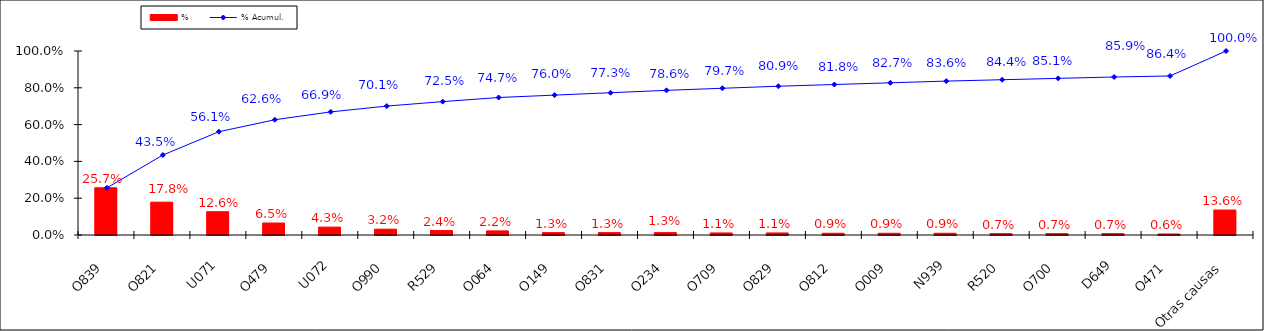
| Category | % |
|---|---|
| O839 | 0.257 |
| O821 | 0.178 |
| U071 | 0.126 |
| O479 | 0.065 |
| U072 | 0.043 |
| O990 | 0.032 |
| R529 | 0.024 |
| O064 | 0.022 |
| O149 | 0.013 |
| O831 | 0.013 |
| O234 | 0.013 |
| O709 | 0.011 |
| O829 | 0.011 |
| O812 | 0.009 |
| O009 | 0.009 |
| N939 | 0.009 |
| R520 | 0.007 |
| O700 | 0.007 |
| D649 | 0.007 |
| O471 | 0.006 |
| Otras causas | 0.136 |